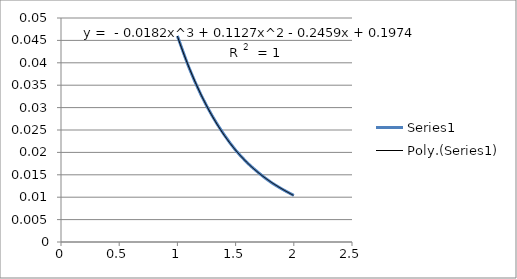
| Category | Series 0 |
|---|---|
| 1.0 | 0.046 |
| 1.1 | 0.039 |
| 1.2 | 0.033 |
| 1.3 | 0.028 |
| 1.4 | 0.024 |
| 1.5 | 0.02 |
| 1.6 | 0.018 |
| 1.7 | 0.015 |
| 1.8 | 0.013 |
| 1.9 | 0.012 |
| 2.0 | 0.01 |